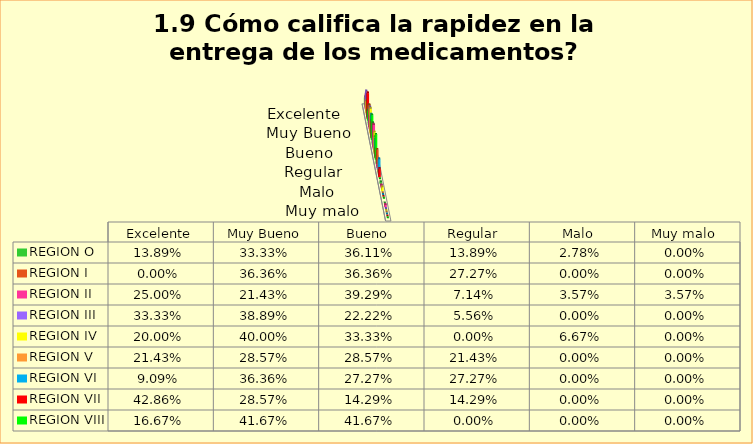
| Category | REGION O | REGION I  | REGION II | REGION III | REGION IV | REGION V  | REGION VI  | REGION VII  | REGION VIII |
|---|---|---|---|---|---|---|---|---|---|
| Excelente | 0.139 | 0 | 0.25 | 0.333 | 0.2 | 0.214 | 0.091 | 0.429 | 0.167 |
| Muy Bueno | 0.333 | 0.364 | 0.214 | 0.389 | 0.4 | 0.286 | 0.364 | 0.286 | 0.417 |
| Bueno  | 0.361 | 0.364 | 0.393 | 0.222 | 0.333 | 0.286 | 0.273 | 0.143 | 0.417 |
| Regular  | 0.139 | 0.273 | 0.071 | 0.056 | 0 | 0.214 | 0.273 | 0.143 | 0 |
| Malo  | 0.028 | 0 | 0.036 | 0 | 0.067 | 0 | 0 | 0 | 0 |
| Muy malo  | 0 | 0 | 0.036 | 0 | 0 | 0 | 0 | 0 | 0 |